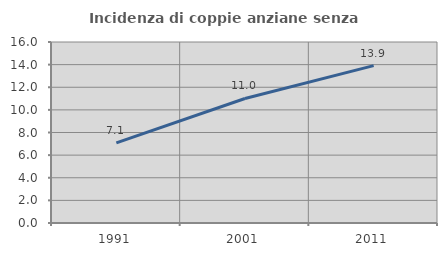
| Category | Incidenza di coppie anziane senza figli  |
|---|---|
| 1991.0 | 7.089 |
| 2001.0 | 11.008 |
| 2011.0 | 13.912 |